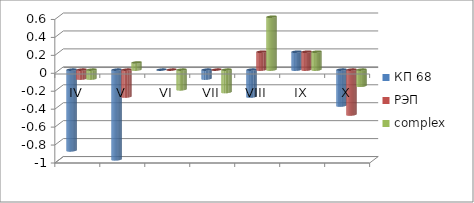
| Category | КП 68 | РЭП  | complex |
|---|---|---|---|
| IV | -0.9 | -0.1 | -0.1 |
| V | -1 | -0.3 | 0.08 |
| VI | 0 | 0 | -0.22 |
| VII | -0.1 | 0 | -0.25 |
| VIII | -0.3 | 0.2 | 0.59 |
| IX | 0.2 | 0.2 | 0.2 |
| X | -0.4 | -0.5 | -0.18 |